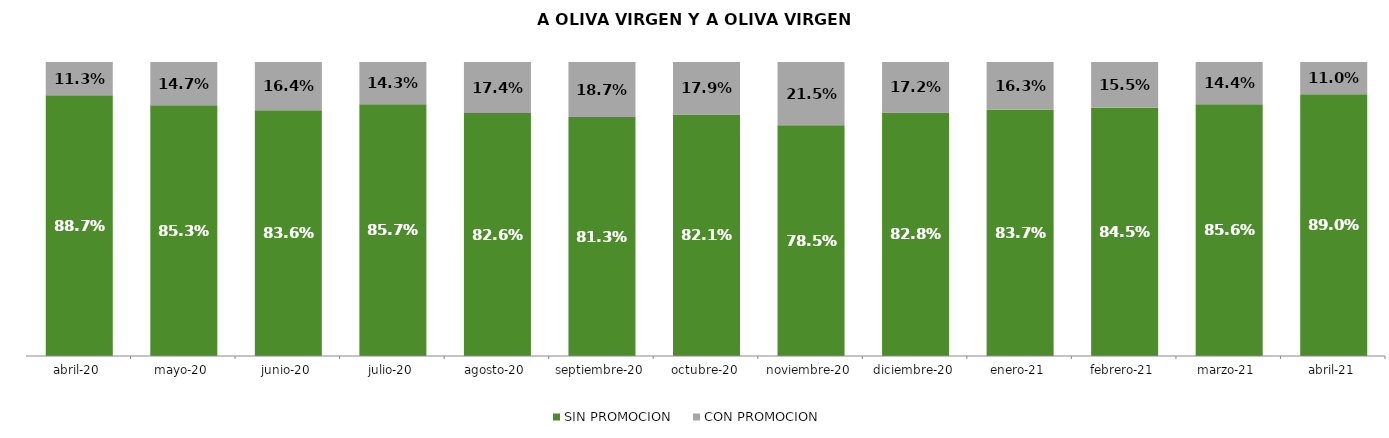
| Category | SIN PROMOCION   | CON PROMOCION   |
|---|---|---|
| 2020-04-01 | 0.887 | 0.113 |
| 2020-05-01 | 0.853 | 0.147 |
| 2020-06-01 | 0.836 | 0.164 |
| 2020-07-01 | 0.857 | 0.143 |
| 2020-08-01 | 0.826 | 0.174 |
| 2020-09-01 | 0.813 | 0.187 |
| 2020-10-01 | 0.821 | 0.179 |
| 2020-11-01 | 0.785 | 0.215 |
| 2020-12-01 | 0.828 | 0.172 |
| 2021-01-01 | 0.837 | 0.163 |
| 2021-02-01 | 0.845 | 0.155 |
| 2021-03-01 | 0.856 | 0.144 |
| 2021-04-01 | 0.89 | 0.11 |